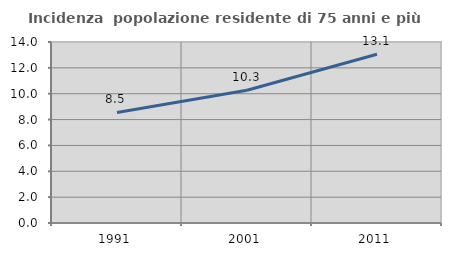
| Category | Incidenza  popolazione residente di 75 anni e più |
|---|---|
| 1991.0 | 8.547 |
| 2001.0 | 10.268 |
| 2011.0 | 13.054 |